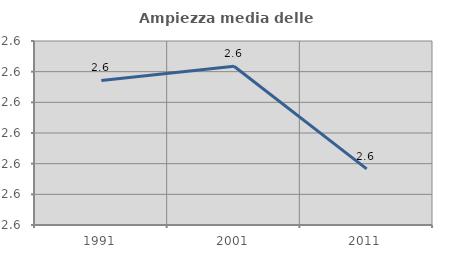
| Category | Ampiezza media delle famiglie |
|---|---|
| 1991.0 | 2.607 |
| 2001.0 | 2.612 |
| 2011.0 | 2.578 |